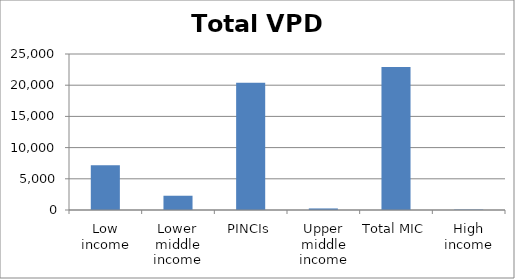
| Category | Series 0 |
|---|---|
| Low income | 7177.198 |
| Lower middle income | 2285.984 |
| PINCIs | 20399.37 |
| Upper middle income | 249.881 |
| Total MIC | 22935.235 |
| High income | 69.847 |